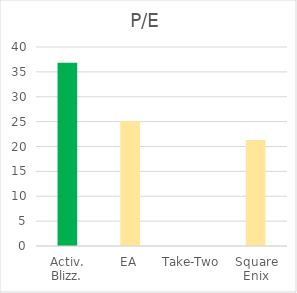
| Category | P/E |
|---|---|
| Activ. Blizz. | 36.83 |
| EA | 25.09 |
| Take-Two | 0 |
| Square Enix | 21.33 |